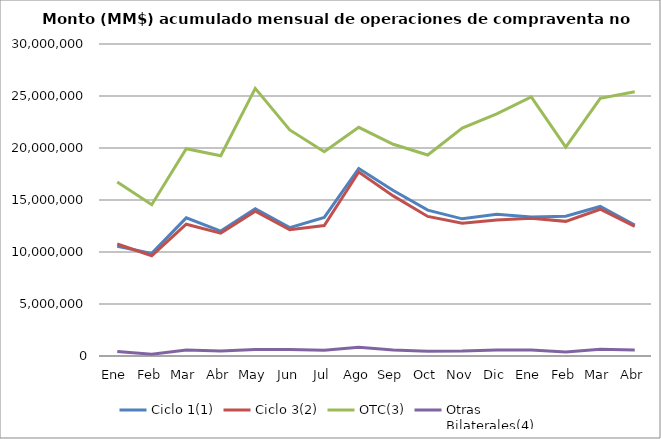
| Category | Ciclo 1(1) | Ciclo 3(2) | OTC(3) | Otras
Bilaterales(4) |
|---|---|---|---|---|
| Ene | 10546788.446 | 10766052.855 | 16733880.464 | 441108.246 |
| Feb | 9865648.605 | 9643015.163 | 14546493.158 | 162828.846 |
| Mar | 13284500.702 | 12671217.696 | 19929559.689 | 579369.626 |
| Abr | 12013284.398 | 11814687.15 | 19251546.959 | 472963.375 |
| May | 14168561.966 | 13923329.027 | 25733408.519 | 633291.784 |
| Jun | 12340302.059 | 12134541.473 | 21740779.901 | 628996.262 |
| Jul | 13325192.123 | 12545118.041 | 19637929.085 | 544511.801 |
| Ago | 18030973.987 | 17687596.998 | 21986660.993 | 842692.021 |
| Sep | 15911017.047 | 15396153.443 | 20361806.772 | 585420.575 |
| Oct | 14024707.977 | 13420544.419 | 19328083.862 | 462712.635 |
| Nov | 13188648.248 | 12772951.51 | 21913468.774 | 469363.683 |
| Dic | 13636796.842 | 13069841.623 | 23282002.87 | 584299.877 |
| Ene | 13368743.504 | 13252582.307 | 24907688.449 | 583765.947 |
| Feb | 13431145.741 | 12946874.395 | 20075396.007 | 377593.299 |
| Mar | 14378352.11 | 14112935.088 | 24782461.824 | 641313.533 |
| Abr | 12596004.104 | 12469067.566 | 25410275.768 | 570340.218 |